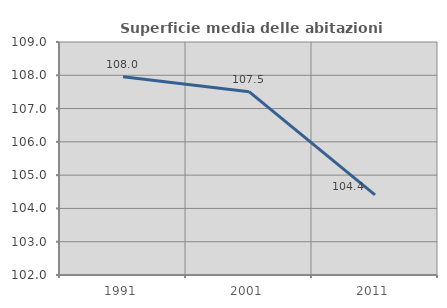
| Category | Superficie media delle abitazioni occupate |
|---|---|
| 1991.0 | 107.959 |
| 2001.0 | 107.507 |
| 2011.0 | 104.406 |